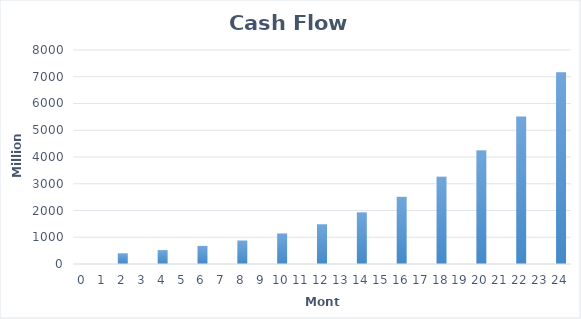
| Category | Series 0 |
|---|---|
| 0.0 | 0 |
| 1.0 | 0 |
| 2.0 | 400 |
| 3.0 | 0 |
| 4.0 | 520 |
| 5.0 | 0 |
| 6.0 | 676 |
| 7.0 | 0 |
| 8.0 | 878.8 |
| 9.0 | 0 |
| 10.0 | 1142.44 |
| 11.0 | 0 |
| 12.0 | 1485.172 |
| 13.0 | 0 |
| 14.0 | 1930.724 |
| 15.0 | 0 |
| 16.0 | 2509.941 |
| 17.0 | 0 |
| 18.0 | 3262.923 |
| 19.0 | 0 |
| 20.0 | 4241.8 |
| 21.0 | 0 |
| 22.0 | 5514.34 |
| 23.0 | 0 |
| 24.0 | 7168.642 |